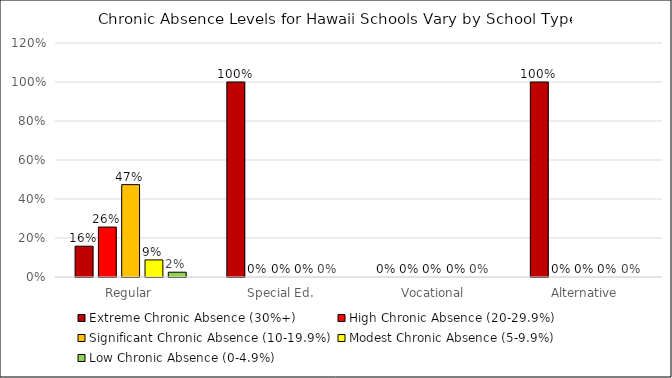
| Category | Extreme Chronic Absence (30%+) | High Chronic Absence (20-29.9%) | Significant Chronic Absence (10-19.9%) | Modest Chronic Absence (5-9.9%) | Low Chronic Absence (0-4.9%) |
|---|---|---|---|---|---|
| Regular | 0.158 | 0.256 | 0.474 | 0.088 | 0.025 |
| Special Ed. | 1 | 0 | 0 | 0 | 0 |
| Vocational | 0 | 0 | 0 | 0 | 0 |
| Alternative | 1 | 0 | 0 | 0 | 0 |